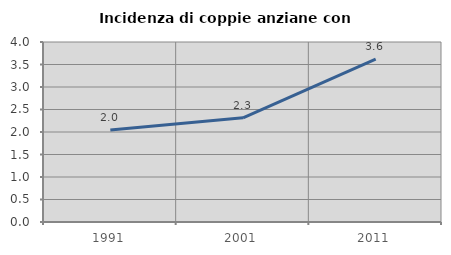
| Category | Incidenza di coppie anziane con figli |
|---|---|
| 1991.0 | 2.042 |
| 2001.0 | 2.316 |
| 2011.0 | 3.622 |